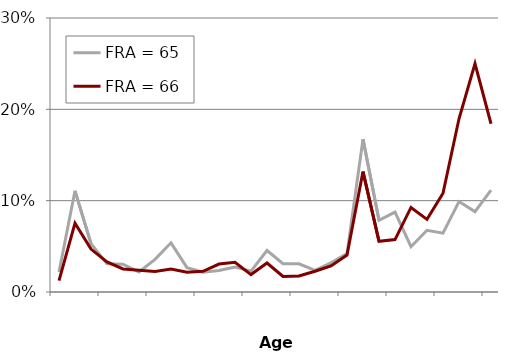
| Category | FRA = 65 | FRA = 66 |
|---|---|---|
| nan | 0.022 | 0.012 |
| 62.0 | 0.111 | 0.075 |
| nan | 0.053 | 0.047 |
| nan | 0.031 | 0.033 |
| 62.5 | 0.03 | 0.025 |
| nan | 0.022 | 0.024 |
| nan | 0.036 | 0.023 |
| 63.0 | 0.054 | 0.025 |
| nan | 0.027 | 0.022 |
| nan | 0.022 | 0.023 |
| 63.5 | 0.024 | 0.031 |
| nan | 0.027 | 0.033 |
| nan | 0.023 | 0.019 |
| 64.0 | 0.045 | 0.032 |
| nan | 0.031 | 0.017 |
| nan | 0.031 | 0.018 |
| 64.5 | 0.024 | 0.023 |
| nan | 0.032 | 0.029 |
| nan | 0.042 | 0.04 |
| 65.0 | 0.167 | 0.132 |
| nan | 0.079 | 0.056 |
| nan | 0.087 | 0.057 |
| 65.5 | 0.05 | 0.093 |
| nan | 0.068 | 0.08 |
| nan | 0.064 | 0.108 |
| 66.0 | 0.099 | 0.19 |
| nan | 0.088 | 0.25 |
| nan | 0.112 | 0.184 |